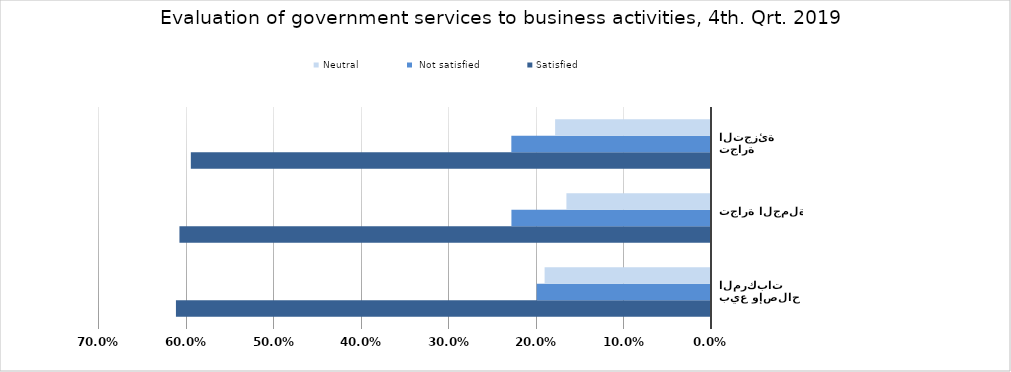
| Category | Satisfied |  Not satisfied | Neutral |
|---|---|---|---|
| بيع وإصلاح المركبات  | 0.611 | 0.199 | 0.19 |
| تجارة الجملة | 0.607 | 0.228 | 0.165 |
| تجارة التجزئة | 0.594 | 0.228 | 0.178 |